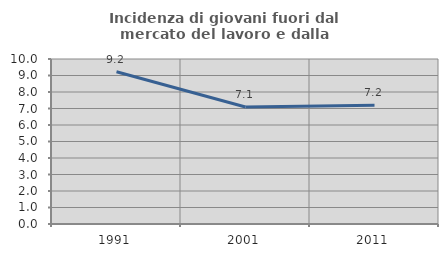
| Category | Incidenza di giovani fuori dal mercato del lavoro e dalla formazione  |
|---|---|
| 1991.0 | 9.224 |
| 2001.0 | 7.09 |
| 2011.0 | 7.198 |